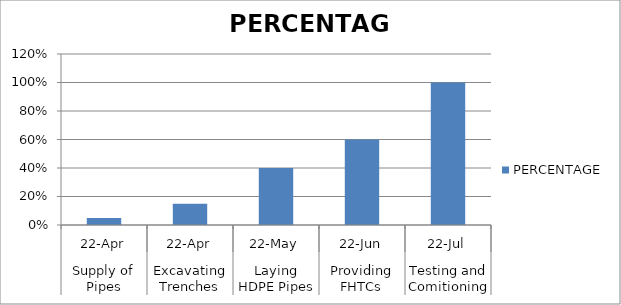
| Category | PERCENTAGE |
|---|---|
| 0 | 0.05 |
| 1 | 0.15 |
| 2 | 0.4 |
| 3 | 0.6 |
| 4 | 1 |